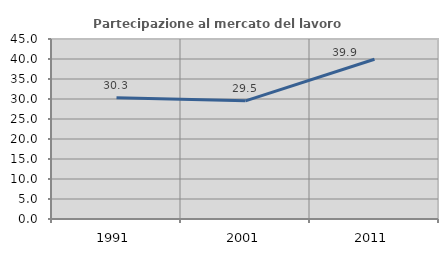
| Category | Partecipazione al mercato del lavoro  femminile |
|---|---|
| 1991.0 | 30.323 |
| 2001.0 | 29.54 |
| 2011.0 | 39.947 |